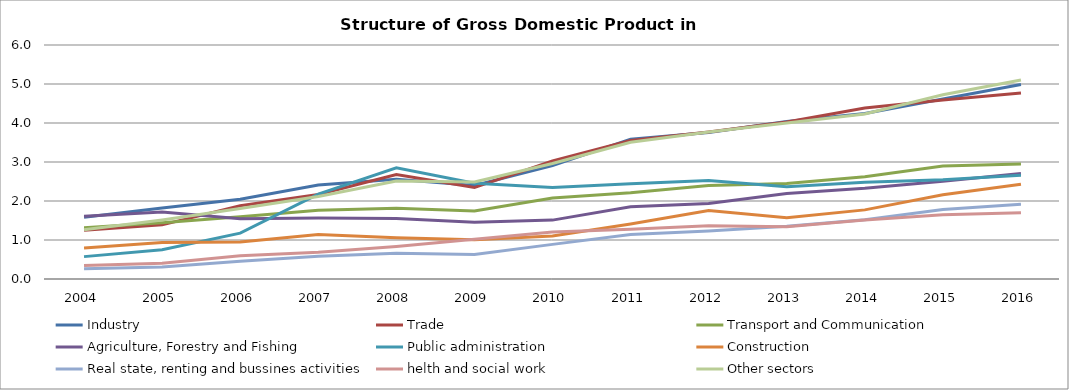
| Category | Industry | Trade | Transport and Communication | Agriculture, Forestry and Fishing | Public administration | Construction | Real state, renting and bussines activities | helth and social work | Other sectors |
|---|---|---|---|---|---|---|---|---|---|
| 2004.0 | 1.582 | 1.247 | 1.313 | 1.611 | 0.574 | 0.793 | 0.262 | 0.346 | 1.261 |
| 2005.0 | 1.823 | 1.389 | 1.443 | 1.716 | 0.75 | 0.938 | 0.305 | 0.404 | 1.516 |
| 2006.0 | 2.047 | 1.879 | 1.594 | 1.544 | 1.175 | 0.947 | 0.456 | 0.598 | 1.807 |
| 2007.0 | 2.41 | 2.167 | 1.765 | 1.563 | 2.177 | 1.141 | 0.584 | 0.689 | 2.115 |
| 2008.0 | 2.555 | 2.681 | 1.813 | 1.551 | 2.85 | 1.058 | 0.663 | 0.835 | 2.515 |
| 2009.0 | 2.4 | 2.344 | 1.746 | 1.457 | 2.458 | 1.004 | 0.628 | 1.021 | 2.488 |
| 2010.0 | 2.907 | 3.025 | 2.077 | 1.51 | 2.343 | 1.1 | 0.888 | 1.202 | 2.963 |
| 2011.0 | 3.585 | 3.553 | 2.212 | 1.855 | 2.443 | 1.408 | 1.139 | 1.276 | 3.506 |
| 2012.0 | 3.757 | 3.769 | 2.396 | 1.933 | 2.526 | 1.757 | 1.232 | 1.362 | 3.772 |
| 2013.0 | 4.037 | 4.027 | 2.451 | 2.195 | 2.365 | 1.568 | 1.352 | 1.338 | 4.001 |
| 2014.0 | 4.244 | 4.386 | 2.622 | 2.328 | 2.479 | 1.772 | 1.518 | 1.515 | 4.232 |
| 2015.0 | 4.615 | 4.589 | 2.897 | 2.508 | 2.546 | 2.158 | 1.785 | 1.648 | 4.724 |
| 2016.0 | 4.985 | 4.77 | 2.949 | 2.703 | 2.661 | 2.431 | 1.914 | 1.7 | 5.103 |